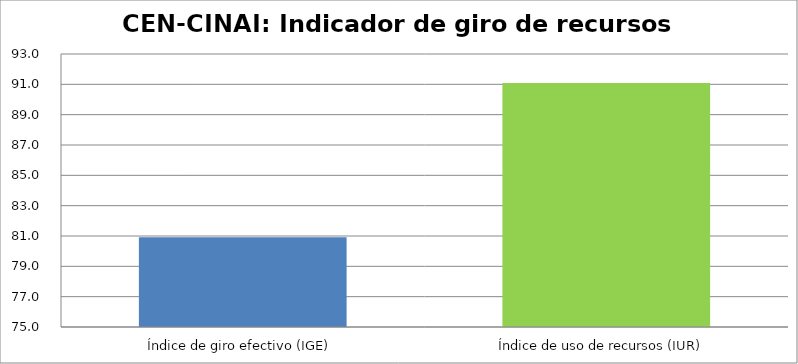
| Category | Series 0 |
|---|---|
| Índice de giro efectivo (IGE) | 80.922 |
| Índice de uso de recursos (IUR)  | 91.082 |